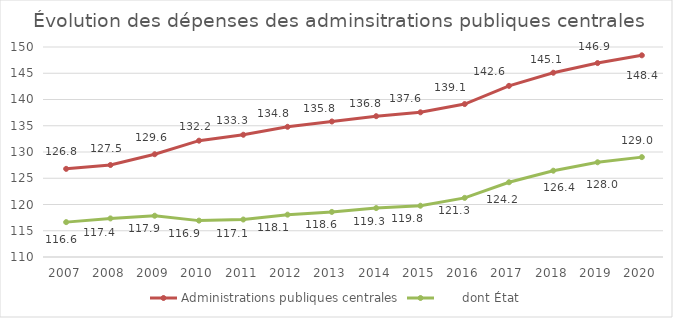
| Category | Dépenses de rémunération (en Md€) | Administrations publiques centrales |       dont État |
|---|---|---|---|
| 2007.0 |  | 126.79 | 116.642 |
| 2008.0 |  | 127.52 | 117.351 |
| 2009.0 |  | 129.576 | 117.863 |
| 2010.0 |  | 132.157 | 116.93 |
| 2011.0 |  | 133.284 | 117.138 |
| 2012.0 |  | 134.798 | 118.068 |
| 2013.0 |  | 135.812 | 118.588 |
| 2014.0 |  | 136.823 | 119.319 |
| 2015.0 |  | 137.558 | 119.766 |
| 2016.0 |  | 139.13 | 121.262 |
| 2017.0 |  | 142.601 | 124.236 |
| 2018.0 |  | 145.097 | 126.437 |
| 2019.0 |  | 146.94 | 128.043 |
| 2020.0 |  | 148.416 | 129.024 |